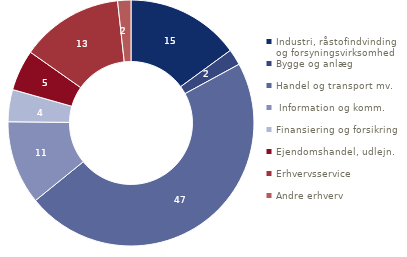
| Category | Series 0 |
|---|---|
| Industri, råstofindvinding og forsyningsvirksomhed | 14.957 |
| Bygge og anlæg | 2.122 |
| Handel og transport mv. | 47.069 |
|  Information og komm. | 11.016 |
| Finansiering og forsikring | 4.219 |
| Ejendomshandel, udlejn. | 5.382 |
| Erhvervsservice | 13.492 |
| Andre erhverv | 1.743 |